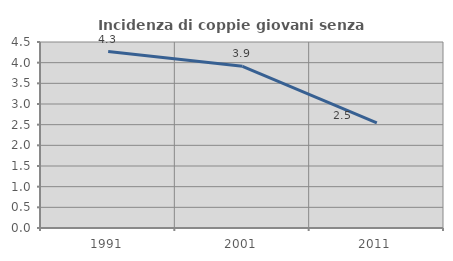
| Category | Incidenza di coppie giovani senza figli |
|---|---|
| 1991.0 | 4.268 |
| 2001.0 | 3.911 |
| 2011.0 | 2.546 |